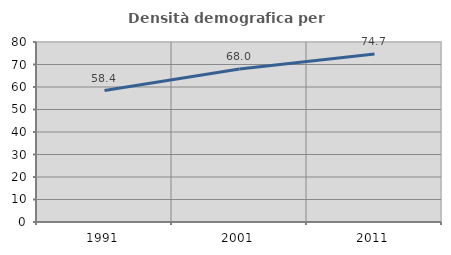
| Category | Densità demografica |
|---|---|
| 1991.0 | 58.443 |
| 2001.0 | 68.04 |
| 2011.0 | 74.717 |